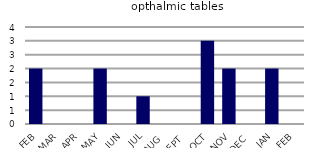
| Category | opthalmic tables |
|---|---|
| FEB | 2 |
| MAR | 0 |
| APR | 0 |
| MAY | 2 |
| JUN | 0 |
| JUL | 1 |
| AUG | 0 |
| SEPT | 0 |
| OCT | 3 |
| NOV | 2 |
| DEC | 0 |
| JAN | 2 |
| FEB | 0 |